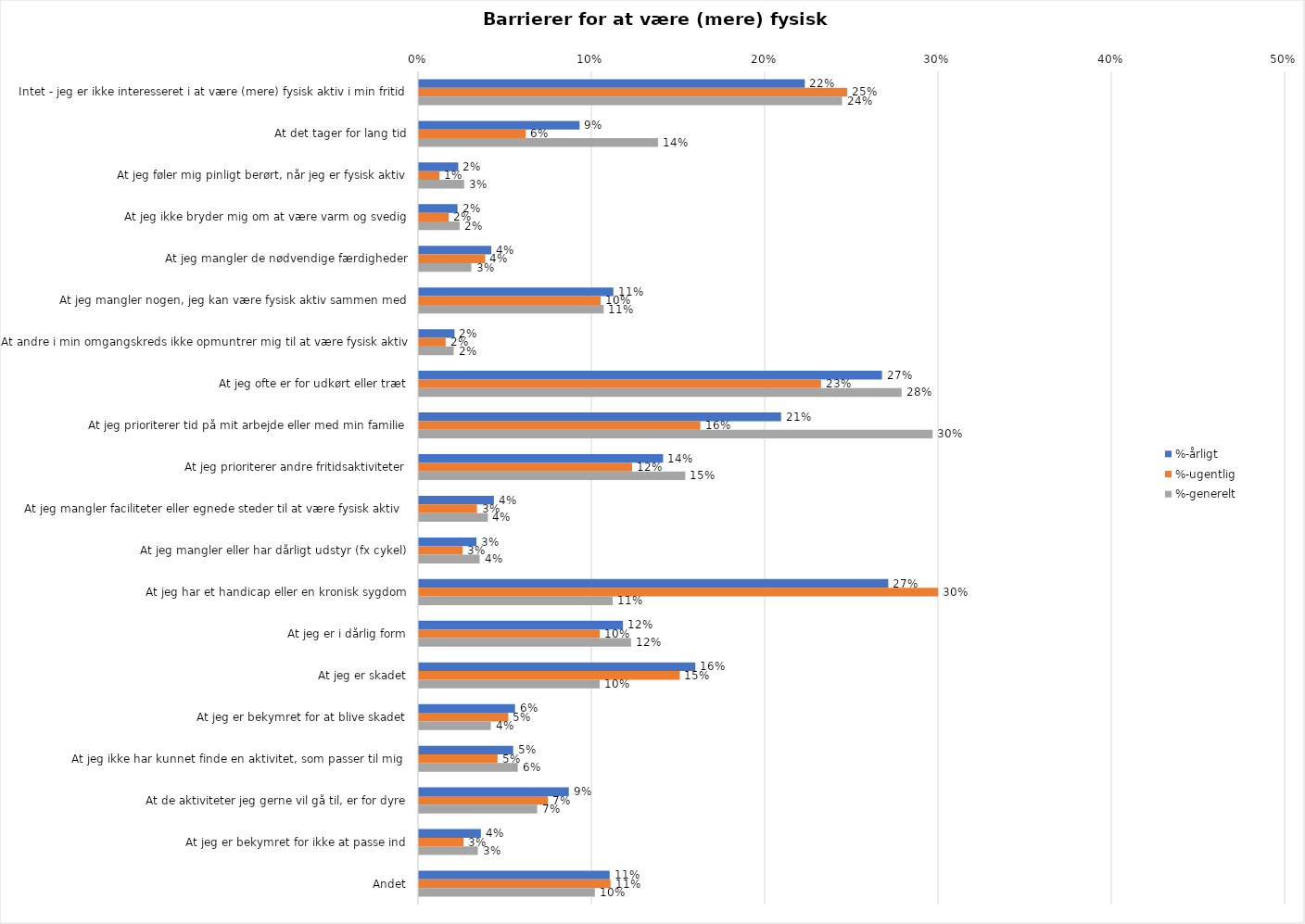
| Category | %-årligt | %-ugentlig | %-generelt |
|---|---|---|---|
| Intet - jeg er ikke interesseret i at være (mere) fysisk aktiv i min fritid | 0.223 | 0.247 | 0.244 |
| At det tager for lang tid | 0.093 | 0.062 | 0.138 |
| At jeg føler mig pinligt berørt, når jeg er fysisk aktiv | 0.023 | 0.012 | 0.026 |
| At jeg ikke bryder mig om at være varm og svedig | 0.022 | 0.017 | 0.023 |
| At jeg mangler de nødvendige færdigheder | 0.042 | 0.038 | 0.03 |
| At jeg mangler nogen, jeg kan være fysisk aktiv sammen med | 0.112 | 0.105 | 0.107 |
| At andre i min omgangskreds ikke opmuntrer mig til at være fysisk aktiv | 0.021 | 0.015 | 0.02 |
| At jeg ofte er for udkørt eller træt | 0.267 | 0.232 | 0.279 |
| At jeg prioriterer tid på mit arbejde eller med min familie | 0.209 | 0.162 | 0.296 |
| At jeg prioriterer andre fritidsaktiviteter | 0.141 | 0.123 | 0.154 |
| At jeg mangler faciliteter eller egnede steder til at være fysisk aktiv  | 0.043 | 0.033 | 0.04 |
| At jeg mangler eller har dårligt udstyr (fx cykel) | 0.033 | 0.025 | 0.035 |
| At jeg har et handicap eller en kronisk sygdom | 0.271 | 0.3 | 0.112 |
| At jeg er i dårlig form | 0.118 | 0.104 | 0.122 |
| At jeg er skadet | 0.159 | 0.151 | 0.104 |
| At jeg er bekymret for at blive skadet | 0.055 | 0.052 | 0.041 |
| At jeg ikke har kunnet finde en aktivitet, som passer til mig  | 0.054 | 0.045 | 0.057 |
| At de aktiviteter jeg gerne vil gå til, er for dyre | 0.086 | 0.074 | 0.068 |
| At jeg er bekymret for ikke at passe ind | 0.036 | 0.026 | 0.034 |
| Andet | 0.11 | 0.111 | 0.102 |